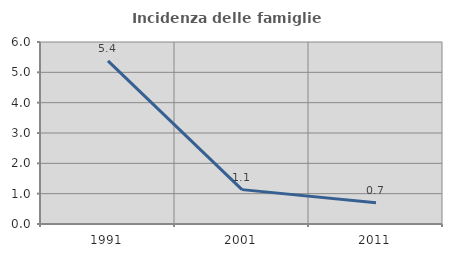
| Category | Incidenza delle famiglie numerose |
|---|---|
| 1991.0 | 5.38 |
| 2001.0 | 1.133 |
| 2011.0 | 0.701 |